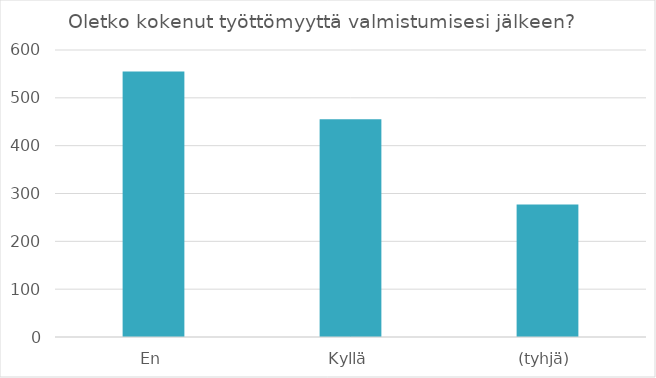
| Category | Summa |
|---|---|
| En | 555 |
| Kyllä | 455 |
| (tyhjä) | 277 |